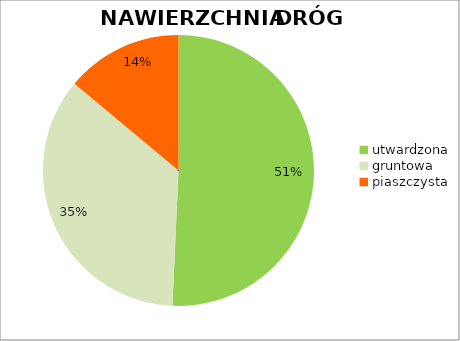
| Category | Series 0 |
|---|---|
| utwardzona | 0.507 |
| gruntowa | 0.354 |
| piaszczysta | 0.139 |